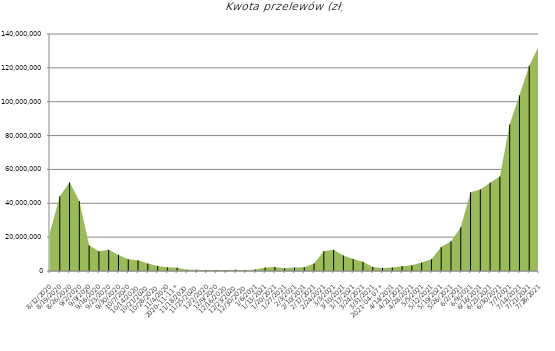
| Category | Kwota przelewów (zł) |
|---|---|
| 2020-08-12 | 22961896.11 |
| 2020-08-19 | 44101784.7 |
| 2020-08-26 | 52355975.79 |
| 2020-09-02 | 41313676.66 |
| 2020-09-09 | 15162233.48 |
| 2020-09-16 | 11660042.1 |
| 2020-09-23 | 12531023.18 |
| 2020-09-30 | 9514160.35 |
| 2020-10-07 | 6917961.06 |
| 2020-10-14 | 6298082.74 |
| 2020-10-21 | 4393968.33 |
| 2020-10-28 | 2929847.04 |
| 2020-11-04 | 2165068.86 |
|    2020-11-11 * | 1954231.13 |
| 2020-11-18 | 767949.47 |
| 2020-11-25 | 682685.13 |
| 2020-12-02 | 530240.71 |
| 2020-12-09 | 497207.4 |
| 2020-12-16 | 562022.92 |
| 2020-12-23 | 726485.9 |
| 2020-12-30 | 465771.62 |
| 2021-01-06 | 858701.02 |
| 2021-01-13 | 2036677.78 |
| 2021-01-20 | 2411692.13 |
| 2021-01-27 | 1614054.32 |
| 2021-02-03 | 2094643.02 |
| 2021-02-10 | 2198851.66 |
| 2021-02-17 | 4449982.5 |
| 2021-02-24 | 11716234.2 |
| 2021-03-03 | 12555430.91 |
| 2021-03-10 | 9195933.94 |
| 2021-03-17 | 7067944.55 |
| 2021-03-24 | 5418188.41 |
| 2021-03-31 | 2362525.91 |
|    2021-04-07 * | 1843629.41 |
| 2021-04-14 | 2090518.81 |
| 2021-04-21 | 2807939.27 |
| 2021-04-28 | 3345793.58 |
| 2021-05-05 | 4965012.13 |
| 2021-05-12 | 6961429.16 |
| 2021-05-19 | 14126989.72 |
| 2021-05-26 | 17520762.74 |
| 2021-06-02 | 25779199.69 |
| 2021-06-09 | 46460743.94 |
| 2021-06-16 | 48211557.17 |
| 2021-06-23 | 52183518.15 |
| 2021-06-30 | 55833285.28 |
| 2021-07-07 | 86561369.69 |
| 2021-07-14 | 103751185.68 |
| 2021-07-21 | 121261504.33 |
| 2021-07-28 | 133089185.08 |